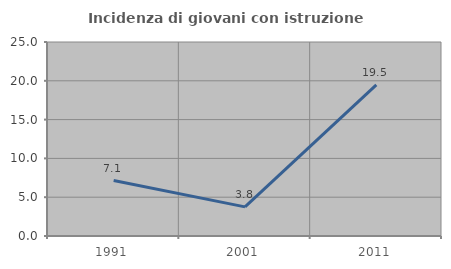
| Category | Incidenza di giovani con istruzione universitaria |
|---|---|
| 1991.0 | 7.143 |
| 2001.0 | 3.756 |
| 2011.0 | 19.474 |